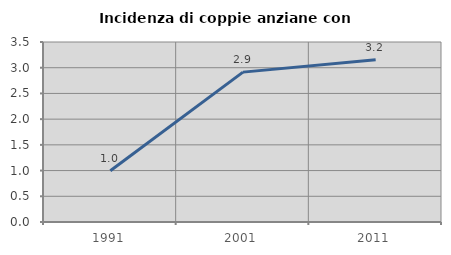
| Category | Incidenza di coppie anziane con figli |
|---|---|
| 1991.0 | 0.995 |
| 2001.0 | 2.914 |
| 2011.0 | 3.155 |